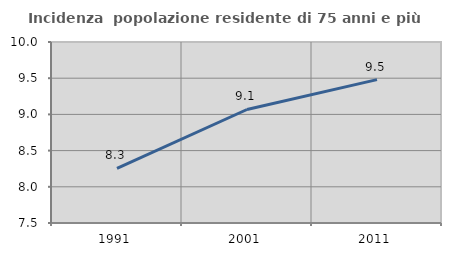
| Category | Incidenza  popolazione residente di 75 anni e più |
|---|---|
| 1991.0 | 8.254 |
| 2001.0 | 9.068 |
| 2011.0 | 9.48 |